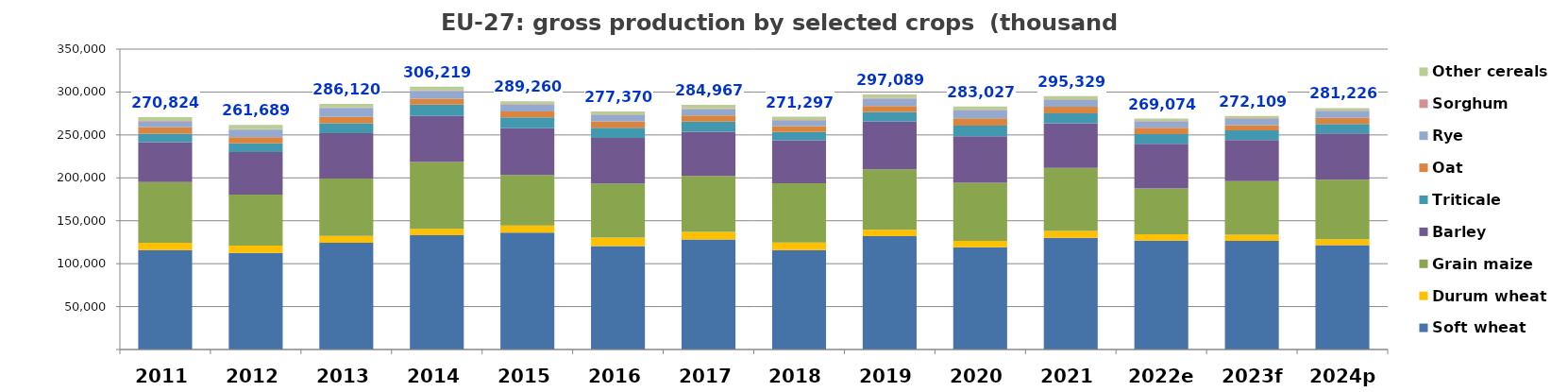
| Category | Soft wheat | Durum wheat | Grain maize | Barley | Triticale | Oat | Rye | Sorghum | Other cereals |
|---|---|---|---|---|---|---|---|---|---|
| 2011 | 115885.1 | 8583 | 70695.81 | 46372.13 | 10073.95 | 7242.2 | 6782.21 | 678.59 | 4510.68 |
| 2012 | 112652 | 8413.98 | 59529.03 | 49479.65 | 10051.21 | 7299.55 | 8679.29 | 496.6 | 5088.14 |
| 2013 | 124300.03 | 8053.97 | 66973.09 | 52762.15 | 11420.78 | 7432.12 | 10416.767 | 729.12 | 4031.863 |
| 2014 | 133042.32 | 7697.68 | 77736 | 53770.47 | 13126.21 | 6946.52 | 8993.683 | 931.96 | 3973.757 |
| 2015 | 136106.53 | 8388.47 | 58765.98 | 54631.35 | 12675.79 | 6786.5 | 7738.969 | 763.85 | 3402.301 |
| 2016 | 120640.99 | 9675.16 | 62963.49 | 53323.6 | 11784.79 | 7321.08 | 7348.528 | 687.76 | 3625.032 |
| 2017 | 128305.83 | 8810.44 | 65048.54 | 51649.65 | 11645.88 | 7321.58 | 7308.71 | 718.67 | 4158.068 |
| 2018 | 115750.56 | 8766.97 | 69308.6 | 49930.74 | 9770.23 | 6886.93 | 6173.96 | 833.11 | 3876.197 |
| 2019 | 132156.37 | 7475.54 | 70416.12 | 55513.8 | 11203.18 | 6944.95 | 8455.156 | 1015.72 | 3908.207 |
| 2020 | 119027.81 | 7422.44 | 67717.28 | 54399.49 | 12347.16 | 8494.09 | 8936.634 | 1029.44 | 3652.92 |
| 2021 | 130023.43 | 8164.69 | 73501.92 | 51883.61 | 11675.34 | 7481.18 | 7948.245 | 814.57 | 3835.665 |
| 2022e | 126803.993 | 7543.56 | 53339.76 | 51861.1 | 11365.83 | 7441.41 | 7449.188 | 530.01 | 2738.732 |
| 2023f | 126608.719 | 7064.87 | 62541.6 | 47939.12 | 11233.69 | 5936.23 | 7611.463 | 852.29 | 2320.812 |
| 2024p | 121701.36 | 6724.624 | 69280.31 | 54172.759 | 11025.839 | 7099.097 | 7784.931 | 773.196 | 2663.652 |